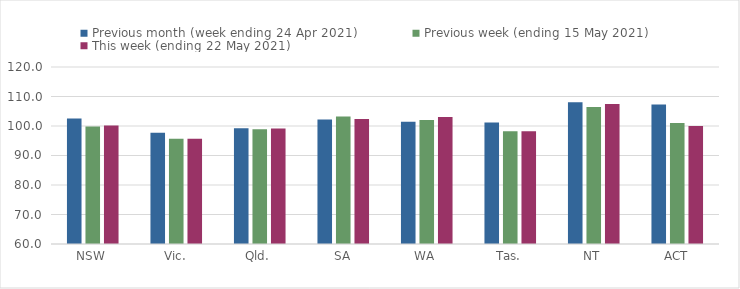
| Category | Previous month (week ending 24 Apr 2021) | Previous week (ending 15 May 2021) | This week (ending 22 May 2021) |
|---|---|---|---|
| NSW | 102.54 | 99.84 | 100.2 |
| Vic. | 97.67 | 95.7 | 95.65 |
| Qld. | 99.22 | 98.9 | 99.17 |
| SA | 102.17 | 103.19 | 102.41 |
| WA | 101.46 | 102.06 | 103.02 |
| Tas. | 101.17 | 98.26 | 98.22 |
| NT | 108.01 | 106.46 | 107.49 |
| ACT | 107.27 | 101 | 100.03 |